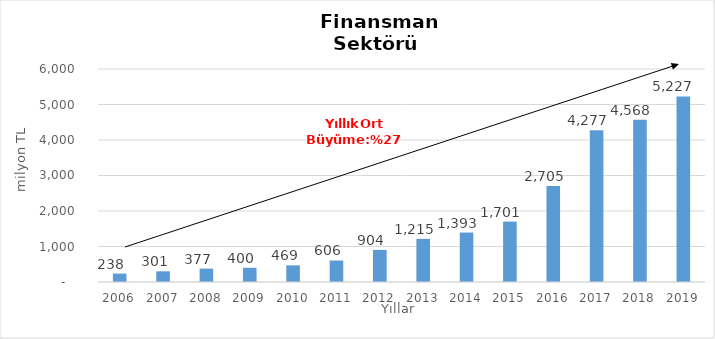
| Category | Finansman |
|---|---|
| 2006.0 | 237.908 |
| 2007.0 | 300.915 |
| 2008.0 | 377.007 |
| 2009.0 | 400.22 |
| 2010.0 | 468.569 |
| 2011.0 | 605.744 |
| 2012.0 | 904.24 |
| 2013.0 | 1214.696 |
| 2014.0 | 1393 |
| 2015.0 | 1701 |
| 2016.0 | 2705 |
| 2017.0 | 4277 |
| 2018.0 | 4568 |
| 2019.0 | 5227 |